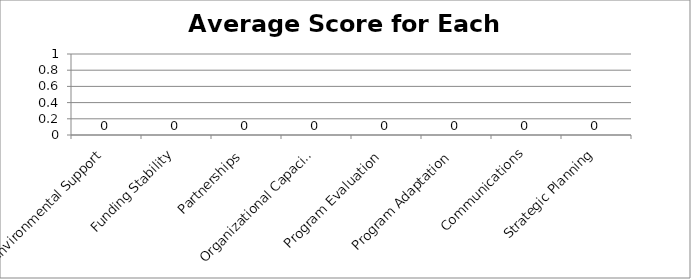
| Category | Average Score for Domain |
|---|---|
| Environmental Support | 0 |
| Funding Stability | 0 |
| Partnerships | 0 |
| Organizational Capacity | 0 |
| Program Evaluation | 0 |
| Program Adaptation | 0 |
| Communications | 0 |
| Strategic Planning | 0 |